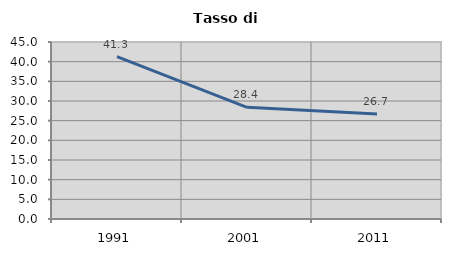
| Category | Tasso di disoccupazione   |
|---|---|
| 1991.0 | 41.268 |
| 2001.0 | 28.399 |
| 2011.0 | 26.706 |